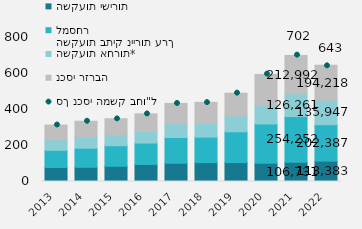
| Category | השקעות ישירות | השקעות בתיק ניירות ערך למסחר | השקעות אחרות* | נכסי רזרבה |
|---|---|---|---|---|
| 2013 | 77745.084 | 95519.668 | 58792 | 81789.758 |
| 2014 | 79010.985 | 106173.258 | 63661 | 86101.168 |
| 2015 | 84695.311 | 114080.897 | 59258 | 90574.784 |
| 2016 | 94632.854 | 119148.01 | 63663 | 98446.771 |
| 2017 | 101540.18 | 142990.21 | 76441 | 113011.493 |
| 2018 | 104878.863 | 141704.212 | 77898 | 115279.449 |
| 2019 | 105096.584 | 171245.432 | 88287 | 126014.202 |
| 2020 | 101670.469 | 218048.751 | 101978.024 | 173297.053 |
| 2021 | 106731.016 | 254251.777 | 126261.256 | 212992.481 |
| 2022 | 113383 | 202387 | 135947 | 194218 |